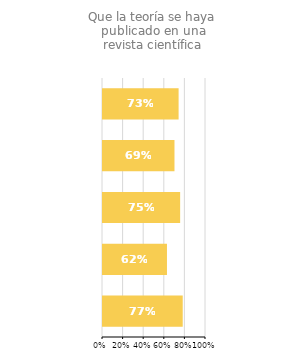
| Category | Que la teoría se haya publicado en una revista científica |
|---|---|
| Turquía | 0.774 |
| Israel | 0.621 |
| Estados Unidos | 0.749 |
| España | 0.694 |
| Total Europa | 0.734 |